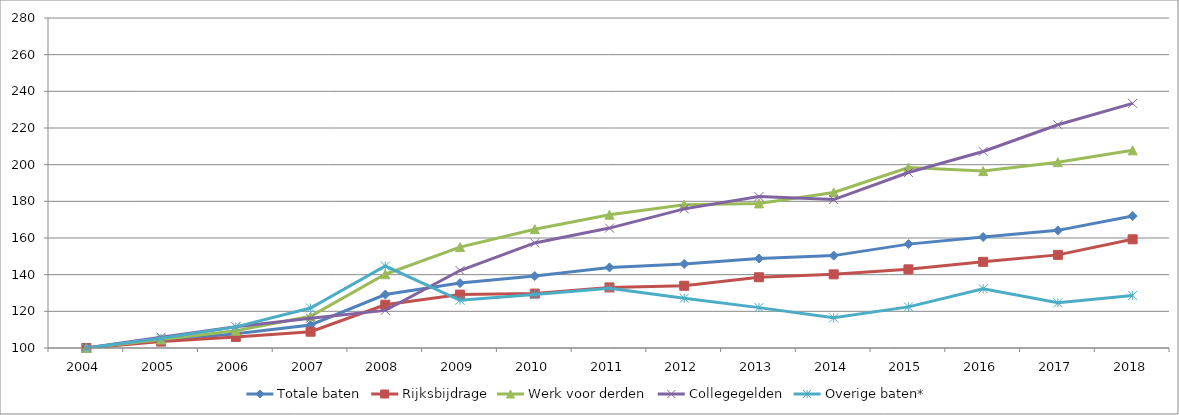
| Category | Totale baten | Rijksbijdrage | Werk voor derden | Collegegelden | Overige baten* |
|---|---|---|---|---|---|
| 2004.0 | 100 | 100 | 100 | 100 | 100 |
| 2005.0 | 104.092 | 103.499 | 104.629 | 105.881 | 105.274 |
| 2006.0 | 107.725 | 106.046 | 109.4 | 111.65 | 111.532 |
| 2007.0 | 112.54 | 108.881 | 117.297 | 116.238 | 121.792 |
| 2008.0 | 129.159 | 123.607 | 140.241 | 120.507 | 144.7 |
| 2009.0 | 135.394 | 129.117 | 155.052 | 142.268 | 126.04 |
| 2010.0 | 139.236 | 129.673 | 164.812 | 157.305 | 129.194 |
| 2011.0 | 143.936 | 133.048 | 172.718 | 165.412 | 132.613 |
| 2012.0 | 145.837 | 133.95 | 178.088 | 175.878 | 127.131 |
| 2013.0 | 148.786 | 138.576 | 178.882 | 182.576 | 122.028 |
| 2014.0 | 150.389 | 140.17 | 184.857 | 180.975 | 116.442 |
| 2015.0 | 156.657 | 142.9 | 198.435 | 195.707 | 122.426 |
| 2016.0 | 160.529 | 146.987 | 196.5 | 207.207 | 132.276 |
| 2017.0 | 164.164 | 150.797 | 201.356 | 221.776 | 124.656 |
| 2018.0 | 171.97 | 159.3 | 207.813 | 233.423 | 128.682 |